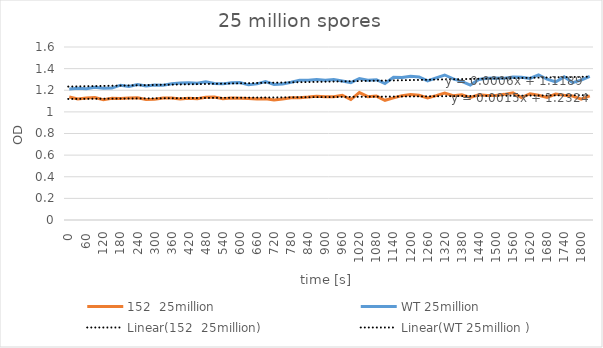
| Category | 152  25million | WT 25million  |
|---|---|---|
| 0.0 | 1.138 | 1.212 |
| 30.0 | 1.119 | 1.218 |
| 60.0 | 1.129 | 1.215 |
| 90.0 | 1.132 | 1.228 |
| 120.0 | 1.113 | 1.219 |
| 150.0 | 1.125 | 1.22 |
| 180.0 | 1.123 | 1.247 |
| 210.0 | 1.128 | 1.234 |
| 240.0 | 1.131 | 1.252 |
| 270.0 | 1.115 | 1.239 |
| 300.0 | 1.116 | 1.249 |
| 330.0 | 1.129 | 1.247 |
| 360.0 | 1.129 | 1.261 |
| 390.0 | 1.119 | 1.267 |
| 420.0 | 1.125 | 1.27 |
| 450.0 | 1.121 | 1.264 |
| 480.0 | 1.135 | 1.279 |
| 510.0 | 1.137 | 1.262 |
| 540.0 | 1.122 | 1.259 |
| 570.0 | 1.129 | 1.27 |
| 600.0 | 1.127 | 1.272 |
| 630.0 | 1.123 | 1.25 |
| 660.0 | 1.12 | 1.259 |
| 690.0 | 1.122 | 1.28 |
| 720.0 | 1.111 | 1.253 |
| 750.0 | 1.12 | 1.258 |
| 780.0 | 1.13 | 1.274 |
| 810.0 | 1.131 | 1.293 |
| 840.0 | 1.137 | 1.292 |
| 870.0 | 1.145 | 1.3 |
| 900.0 | 1.14 | 1.292 |
| 930.0 | 1.14 | 1.299 |
| 960.0 | 1.154 | 1.285 |
| 990.0 | 1.114 | 1.271 |
| 1020.0 | 1.178 | 1.309 |
| 1050.0 | 1.141 | 1.292 |
| 1080.0 | 1.146 | 1.298 |
| 1110.0 | 1.107 | 1.262 |
| 1140.0 | 1.129 | 1.319 |
| 1170.0 | 1.15 | 1.317 |
| 1200.0 | 1.16 | 1.329 |
| 1230.0 | 1.153 | 1.323 |
| 1260.0 | 1.129 | 1.286 |
| 1290.0 | 1.15 | 1.314 |
| 1320.0 | 1.173 | 1.341 |
| 1350.0 | 1.149 | 1.305 |
| 1380.0 | 1.158 | 1.282 |
| 1410.0 | 1.134 | 1.248 |
| 1440.0 | 1.158 | 1.299 |
| 1470.0 | 1.152 | 1.31 |
| 1500.0 | 1.152 | 1.313 |
| 1530.0 | 1.162 | 1.312 |
| 1560.0 | 1.176 | 1.322 |
| 1590.0 | 1.132 | 1.32 |
| 1620.0 | 1.168 | 1.309 |
| 1650.0 | 1.153 | 1.343 |
| 1680.0 | 1.134 | 1.302 |
| 1710.0 | 1.165 | 1.277 |
| 1740.0 | 1.154 | 1.324 |
| 1770.0 | 1.147 | 1.271 |
| 1800.0 | 1.118 | 1.294 |
| 1830.0 | 1.148 | 1.329 |